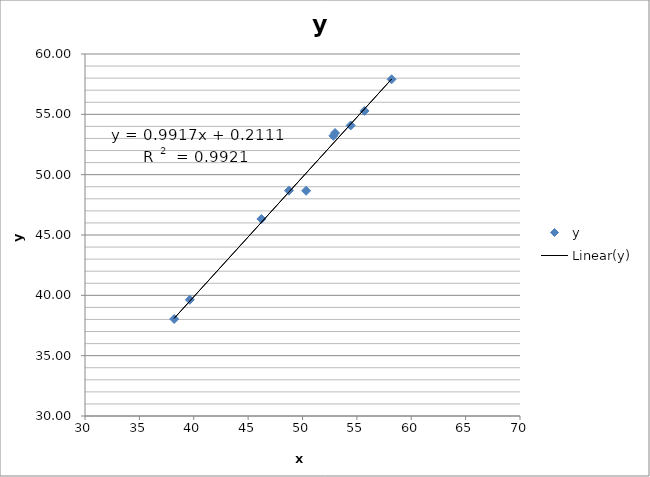
| Category | y |
|---|---|
| 50.33550691114215 | 48.666 |
| 48.75071239330282 | 48.678 |
| 52.991509973071516 | 53.455 |
| 52.84007910522632 | 53.216 |
| 58.190932021534536 | 57.902 |
| 55.70080374018289 | 55.286 |
| 38.203671819064766 | 38.04 |
| 39.63698999432381 | 39.633 |
| 54.43279191131296 | 54.077 |
| 46.219582953926874 | 46.329 |